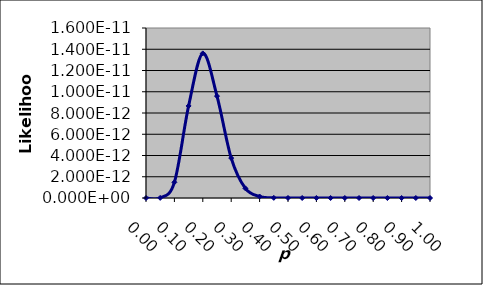
| Category | Likelihood |
|---|---|
| 0.0 | 0 |
| 0.05 | 0 |
| 0.1 | 0 |
| 0.15 | 0 |
| 0.2 | 0 |
| 0.25 | 0 |
| 0.3 | 0 |
| 0.35 | 0 |
| 0.4 | 0 |
| 0.45 | 0 |
| 0.5 | 0 |
| 0.55 | 0 |
| 0.6 | 0 |
| 0.65 | 0 |
| 0.7 | 0 |
| 0.75 | 0 |
| 0.8 | 0 |
| 0.85 | 0 |
| 0.9 | 0 |
| 0.95 | 0 |
| 1.0 | 0 |